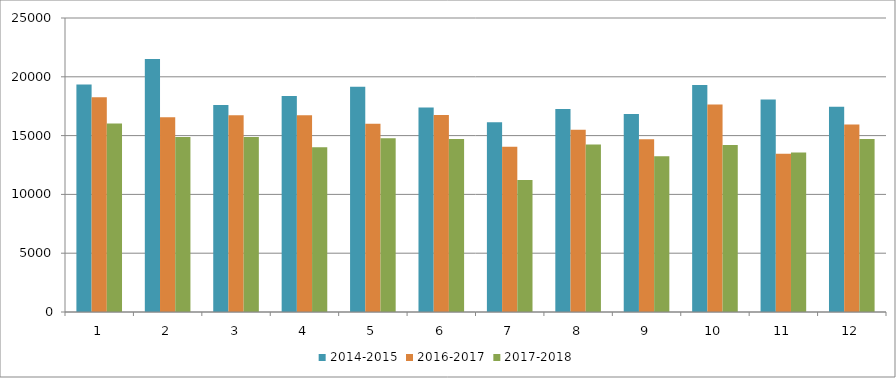
| Category | 2014-2015 | 2016-2017 | 2017-2018 |
|---|---|---|---|
| 0 | 19348 | 18270 | 16024 |
| 1 | 21503 | 16568 | 14887 |
| 2 | 17610 | 16727 | 14883 |
| 3 | 18371 | 16720 | 14019 |
| 4 | 19162 | 16012 | 14783 |
| 5 | 17391 | 16756 | 14702 |
| 6 | 16135 | 14044 | 11233 |
| 7 | 17260 | 15501 | 14251 |
| 8 | 16836 | 14695 | 13237 |
| 9 | 19307 | 17638 | 14200 |
| 10 | 18063 | 13452 | 13566 |
| 11 | 17449 | 15949 | 14705 |